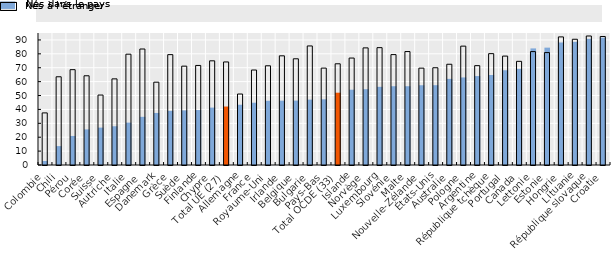
| Category | Nés à l’étranger | Nés dans le pays |
|---|---|---|
| Colombie | 2.9 | 37.5 |
| Chili | 13.6 | 63.5 |
| Pérou | 20.902 | 68.609 |
| Corée | 25.612 | 64.217 |
| Suisse | 26.908 | 50.337 |
| Autriche | 27.874 | 61.992 |
| Italie | 30.502 | 79.741 |
| Espagne | 34.665 | 83.475 |
| Danemark | 37.455 | 59.604 |
| Grèce | 38.963 | 79.43 |
| Suède | 39.305 | 71.141 |
| Finlande | 39.559 | 71.652 |
| Chypre | 41.311 | 74.98 |
| Total UE (27) | 42.078 | 74.168 |
| Allemagne | 43.375 | 51.086 |
| France | 44.826 | 68.355 |
| Royaume-Uni | 46.217 | 71.401 |
| Irlande | 46.299 | 78.572 |
| Belgique | 46.346 | 76.443 |
| Bulgarie | 47.059 | 85.681 |
| Pays-Bas | 47.279 | 69.739 |
| Total OCDE (33) | 52.03 | 72.844 |
| Islande | 54.189 | 76.969 |
| Norvège | 54.55 | 84.29 |
| Luxembourg | 56.262 | 84.457 |
| Slovénie | 56.685 | 79.456 |
| Malte | 56.685 | 81.649 |
| Nouvelle-Zélande | 57.396 | 69.702 |
| États-Unis | 57.432 | 69.993 |
| Australie | 61.993 | 72.501 |
| Pologne | 63.01 | 85.544 |
| Argentine | 64 | 71.5 |
| République tchèque | 64.773 | 80.137 |
| Portugal | 68.183 | 78.38 |
| Canada | 69.204 | 74.61 |
| Lettonie | 83.907 | 81.617 |
| Estonie | 84.466 | 80.9 |
| Hongrie | 88.17 | 92.199 |
| Lituanie | 88.621 | 90.494 |
| République slovaque | 90.798 | 92.848 |
| Croatie | 91.637 | 92.486 |